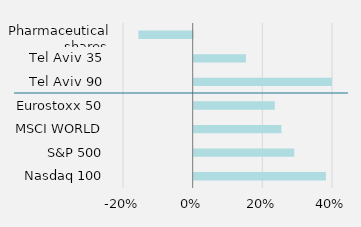
| Category | Annual |
|---|---|
| Nasdaq 100 | 0.38 |
| S&P 500 | 0.289 |
| MSCI WORLD | 0.252 |
| Eurostoxx 50 | 0.233 |
| Tel Aviv 90 | 0.403 |
| Tel Aviv 35 | 0.15 |
| Pharmaceutical shares | -0.156 |